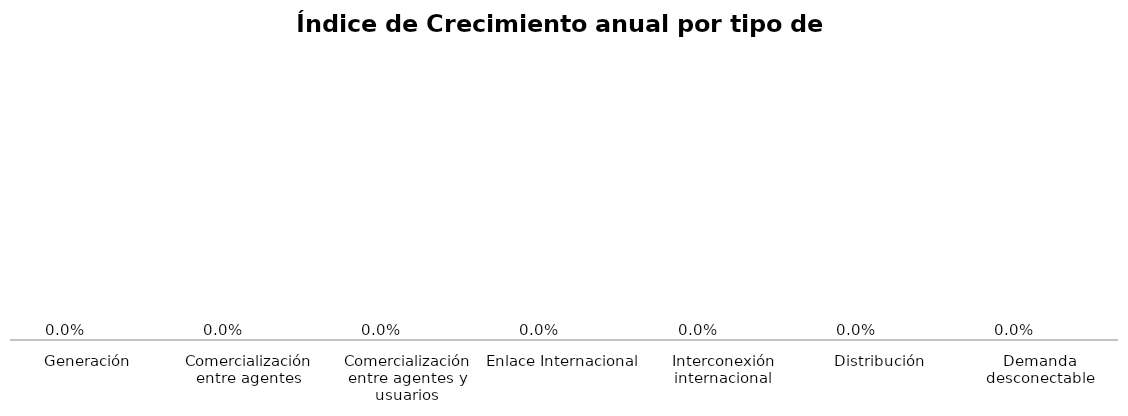
| Category | Series 0 | Series 1 |
|---|---|---|
| Generación | 0 |  |
| Comercialización entre agentes | 0 |  |
| Comercialización entre agentes y usuarios | 0 |  |
| Enlace Internacional | 0 |  |
| Interconexión internacional | 0 |  |
| Distribución | 0 |  |
| Demanda desconectable | 0 |  |